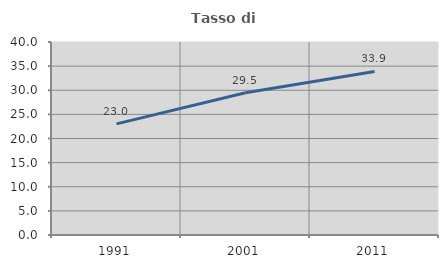
| Category | Tasso di occupazione   |
|---|---|
| 1991.0 | 23.031 |
| 2001.0 | 29.471 |
| 2011.0 | 33.89 |